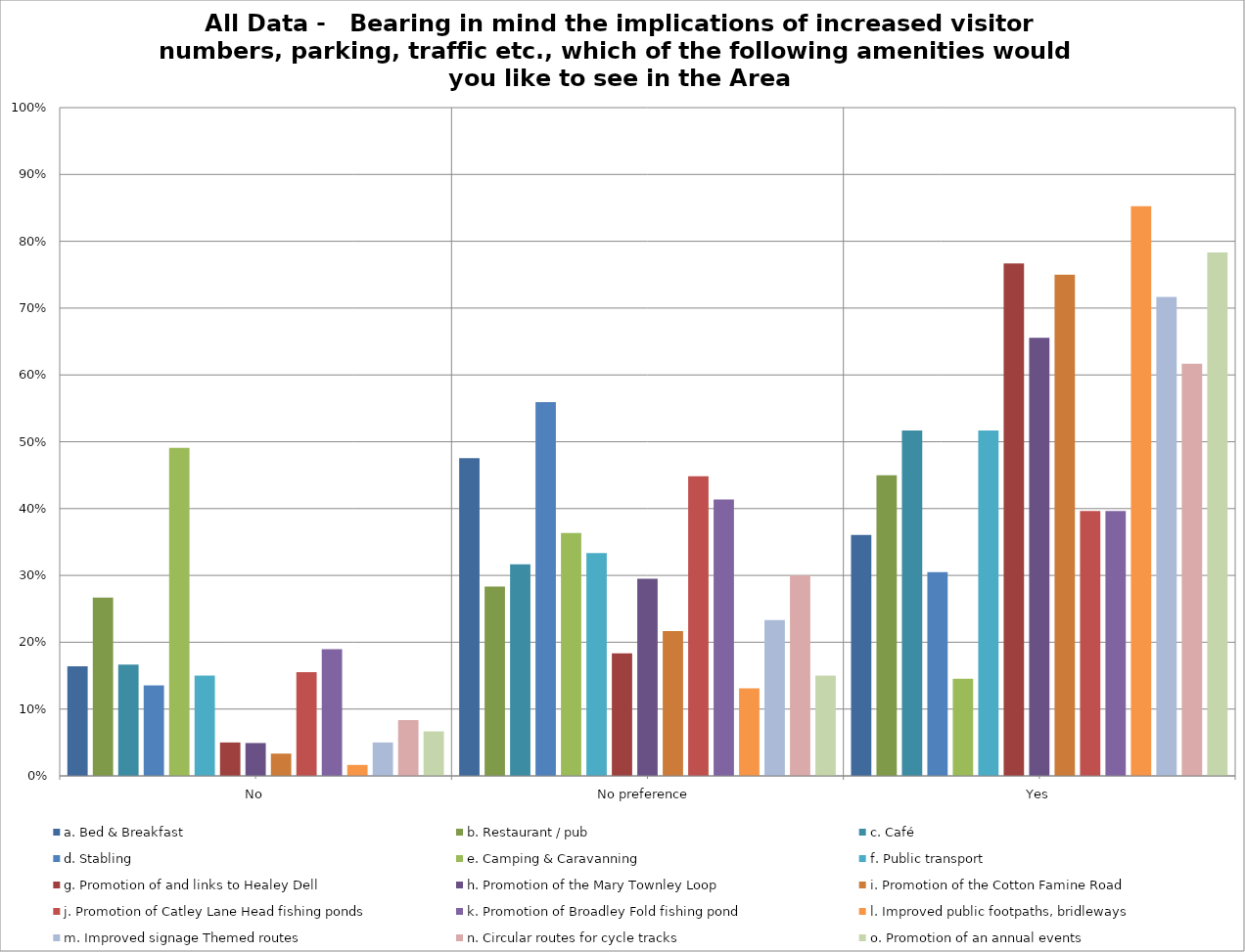
| Category | a. Bed & Breakfast | b. Restaurant / pub | c. Café | d. Stabling | e. Camping & Caravanning | f. Public transport | g. Promotion of and links to Healey Dell | h. Promotion of the Mary Townley Loop | i. Promotion of the Cotton Famine Road | j. Promotion of Catley Lane Head fishing ponds | k. Promotion of Broadley Fold fishing pond | l. Improved public footpaths, bridleways | m. Improved signage Themed routes | n. Circular routes for cycle tracks | o. Promotion of an annual events |
|---|---|---|---|---|---|---|---|---|---|---|---|---|---|---|---|
| No | 0.164 | 0.267 | 0.167 | 0.136 | 0.491 | 0.15 | 0.05 | 0.049 | 0.033 | 0.155 | 0.19 | 0.016 | 0.05 | 0.083 | 0.067 |
| No preference  | 0.475 | 0.283 | 0.317 | 0.559 | 0.364 | 0.333 | 0.183 | 0.295 | 0.217 | 0.448 | 0.414 | 0.131 | 0.233 | 0.3 | 0.15 |
| Yes | 0.361 | 0.45 | 0.517 | 0.305 | 0.145 | 0.517 | 0.767 | 0.656 | 0.75 | 0.397 | 0.397 | 0.852 | 0.717 | 0.617 | 0.783 |